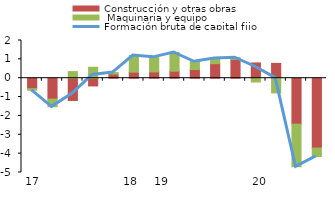
| Category | Construcción y otras obras |  Maquinaria y equipo |
|---|---|---|
| 2015-03-09 | -0.551 | -0.083 |
| 2015-03-10 | -1.109 | -0.406 |
| 2015-03-11 | -1.179 | 0.351 |
| 2015-03-12 | -0.409 | 0.582 |
| 2015-03-13 | 0.22 | 0.079 |
| 2015-03-14 | 0.323 | 0.88 |
| 2015-03-15 | 0.334 | 0.772 |
| 2015-03-16 | 0.373 | 0.991 |
| 2015-03-17 | 0.463 | 0.411 |
| 2015-03-18 | 0.772 | 0.279 |
| 2015-03-19 | 0.994 | 0.093 |
| 2015-03-20 | 0.81 | -0.202 |
| 2015-03-21 | 0.786 | -0.781 |
| 2015-03-22 | -2.436 | -2.257 |
| 2015-03-23 | -3.703 | -0.447 |